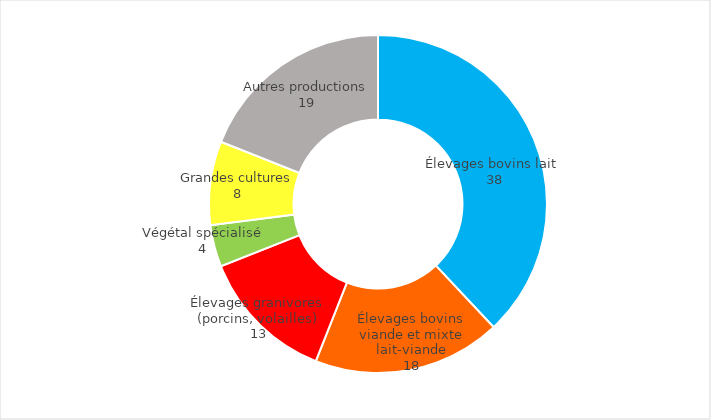
| Category | Series 0 |
|---|---|
| Élevages bovins lait  | 38 |
| Élevages bovins viande et mixte lait-viande | 18 |
| Élevages granivores (porcins, volailles) | 13 |
| Végétal spécialisé | 4 |
| Grandes cultures | 8 |
| Autres productions | 19 |